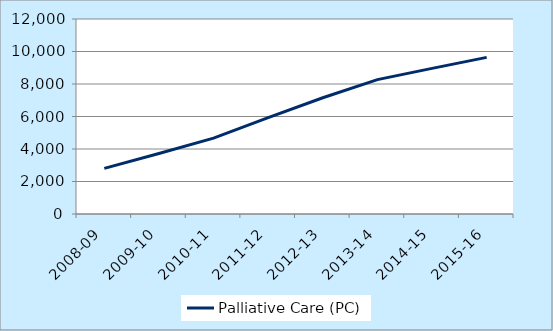
| Category | Palliative Care (PC) |
|---|---|
| 2008-09 | 2810 |
| 2009-10 | 3719 |
| 2010-11 | 4668 |
| 2011-12 | 5935 |
| 2012-13 | 7152 |
| 2013-14 | 8272 |
| 2014-15 | 8962 |
| 2015-16 | 9639 |